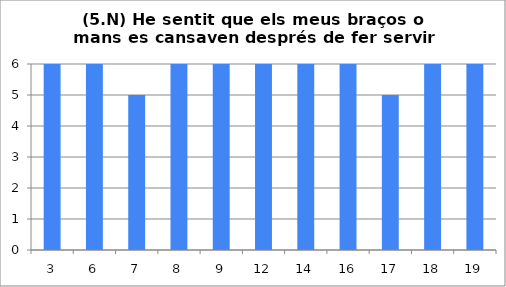
| Category | 5 |
|---|---|
| 3.0 | 6 |
| 6.0 | 6 |
| 7.0 | 5 |
| 8.0 | 6 |
| 9.0 | 6 |
| 12.0 | 6 |
| 14.0 | 6 |
| 16.0 | 6 |
| 17.0 | 5 |
| 18.0 | 6 |
| 19.0 | 6 |